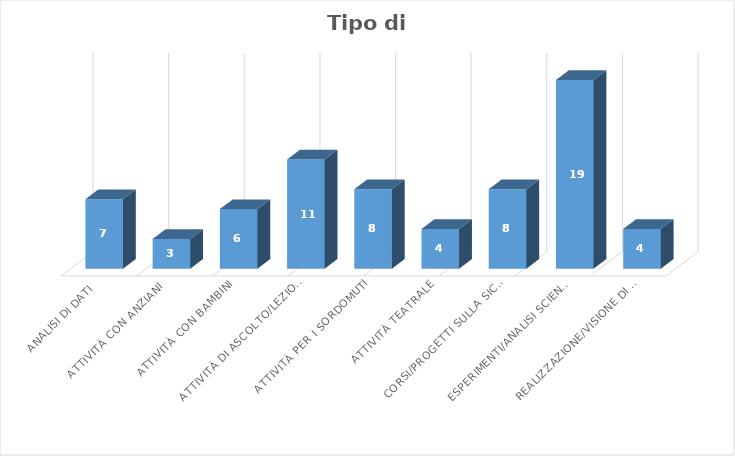
| Category | Series 0 |
|---|---|
| Analisi di dati | 7 |
| Attività con anziani | 3 |
| Attività con bambini | 6 |
| Attività di ascolto/lezione teorica | 11 |
| Attività per i sordomuti | 8 |
| Attività teatrale | 4 |
| Corsi/progetti sulla sicurezza | 8 |
| Esperimenti/analisi scientifici | 19 |
| Realizzazione/visione di testi e/o video | 4 |